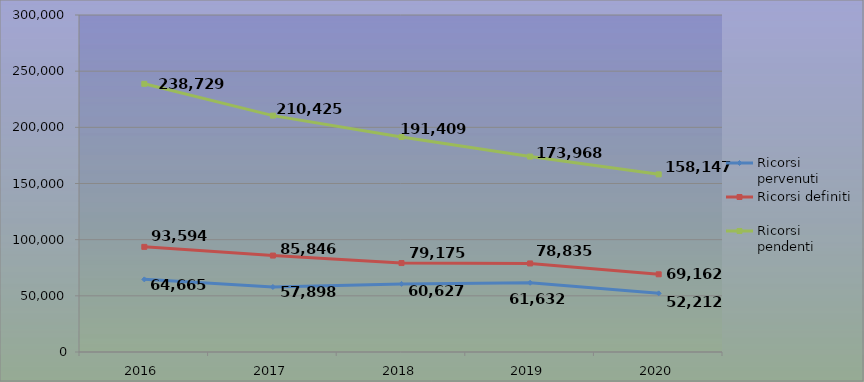
| Category | Ricorsi pervenuti | Ricorsi definiti | Ricorsi pendenti |
|---|---|---|---|
| 2016.0 | 64665 | 93594 | 238729 |
| 2017.0 | 57898 | 85846 | 210425 |
| 2018.0 | 60627 | 79175 | 191409 |
| 2019.0 | 61632 | 78835 | 173968 |
| 2020.0 | 52212 | 69162 | 158147 |